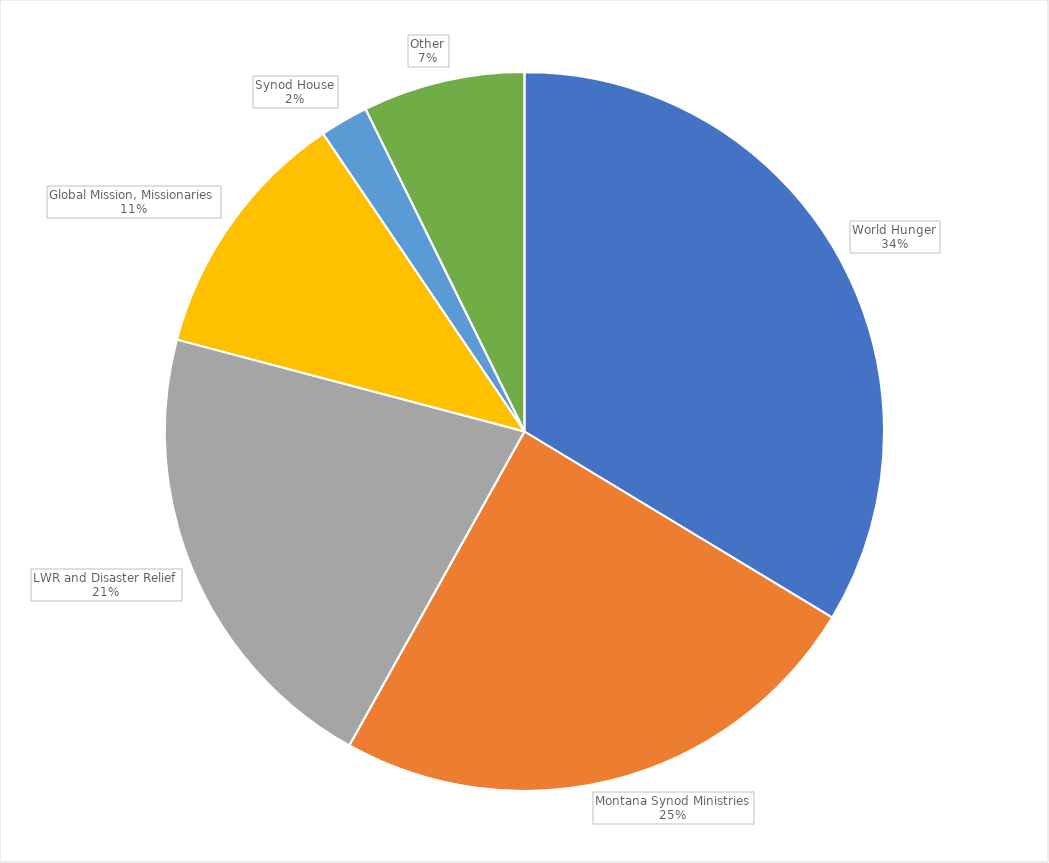
| Category | Series 0 |
|---|---|
| World Hunger | 78221.82 |
| Montana Synod Ministries | 56819.51 |
| LWR and Disaster Relief | 48844.39 |
| Global Mission, Missionaries | 26545.04 |
| Synod House | 5060 |
| Other | 16945.9 |